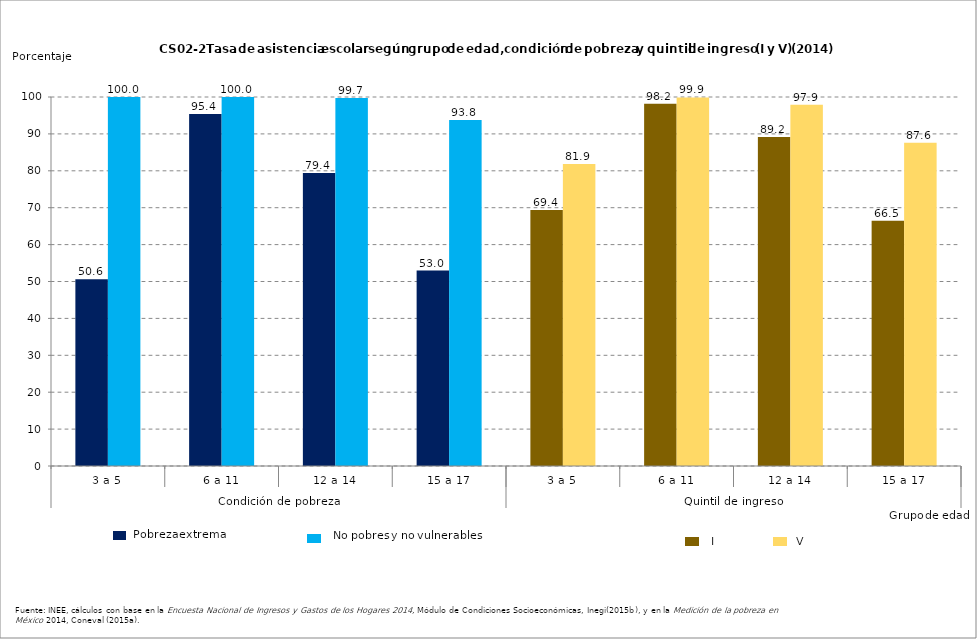
| Category | Series 0 | Series 1 |
|---|---|---|
| 0 | 50.61 | 100 |
| 1 | 95.36 | 100 |
| 2 | 79.39 | 99.71 |
| 3 | 52.95 | 93.79 |
| 4 | 69.39 | 81.87 |
| 5 | 98.2 | 99.87 |
| 6 | 89.17 | 97.93 |
| 7 | 66.45 | 87.61 |